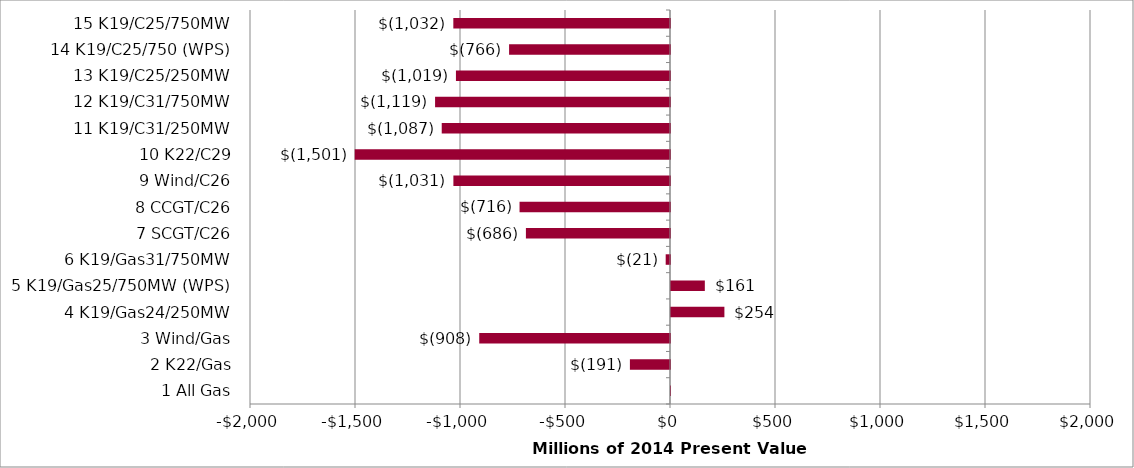
| Category | 35 NPV |
|---|---|
| 1 All Gas | 0.001 |
| 2 K22/Gas | -190.924 |
| 3 Wind/Gas | -908.425 |
| 4 K19/Gas24/250MW | 254.296 |
| 5 K19/Gas25/750MW (WPS) | 161.102 |
| 6 K19/Gas31/750MW | -20.522 |
| 7 SCGT/C26 | -686.147 |
| 8 CCGT/C26 | -716.447 |
| 9 Wind/C26 | -1031.467 |
| 10 K22/C29 | -1501.423 |
| 11 K19/C31/250MW | -1087.008 |
| 12 K19/C31/750MW | -1118.673 |
| 13 K19/C25/250MW | -1019.338 |
| 14 K19/C25/750 (WPS) | -766.271 |
| 15 K19/C25/750MW | -1031.767 |